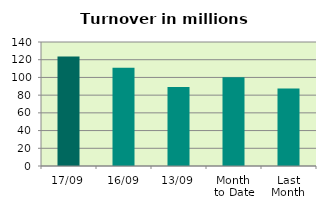
| Category | Series 0 |
|---|---|
| 17/09 | 123.706 |
| 16/09 | 110.804 |
| 13/09 | 89.19 |
| Month 
to Date | 100.232 |
| Last
Month | 87.619 |